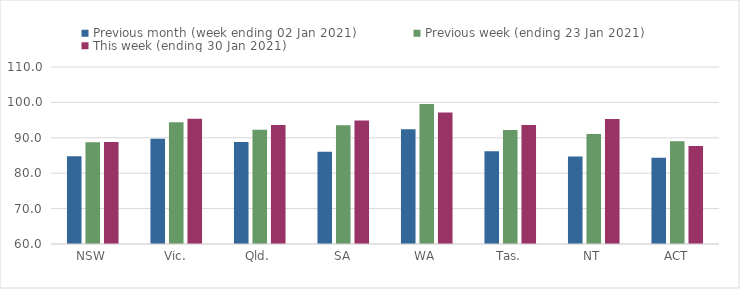
| Category | Previous month (week ending 02 Jan 2021) | Previous week (ending 23 Jan 2021) | This week (ending 30 Jan 2021) |
|---|---|---|---|
| NSW | 84.77 | 88.72 | 88.83 |
| Vic. | 89.72 | 94.36 | 95.37 |
| Qld. | 88.78 | 92.28 | 93.62 |
| SA | 86.03 | 93.52 | 94.89 |
| WA | 92.39 | 99.58 | 97.13 |
| Tas. | 86.19 | 92.19 | 93.64 |
| NT | 84.74 | 91.06 | 95.31 |
| ACT | 84.35 | 89 | 87.67 |